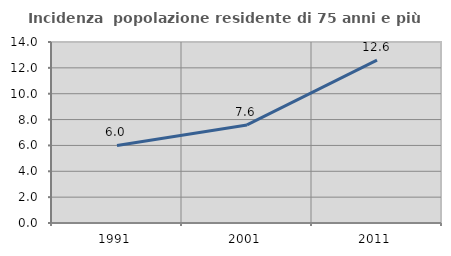
| Category | Incidenza  popolazione residente di 75 anni e più |
|---|---|
| 1991.0 | 5.995 |
| 2001.0 | 7.584 |
| 2011.0 | 12.592 |